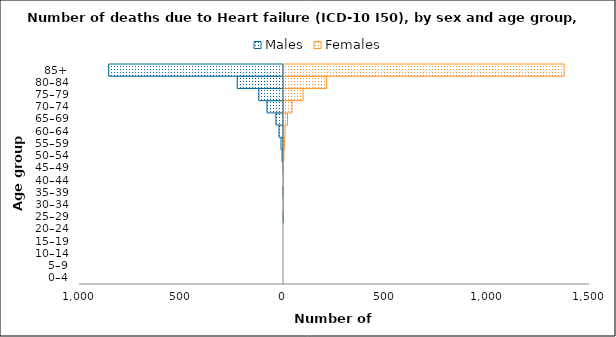
| Category | Males | Females |
|---|---|---|
| 0–4 | 0 | 0 |
| 5–9 | 0 | 0 |
| 10–14 | 0 | 0 |
| 15–19 | 0 | 0 |
| 20–24 | 0 | 0 |
| 25–29 | -1 | 0 |
| 30–34 | 0 | 1 |
| 35–39 | -2 | 2 |
| 40–44 | 0 | 1 |
| 45–49 | -1 | 1 |
| 50–54 | -7 | 4 |
| 55–59 | -12 | 7 |
| 60–64 | -22 | 10 |
| 65–69 | -37 | 22 |
| 70–74 | -81 | 44 |
| 75–79 | -121 | 98 |
| 80–84 | -227 | 214 |
| 85+ | -857 | 1378 |